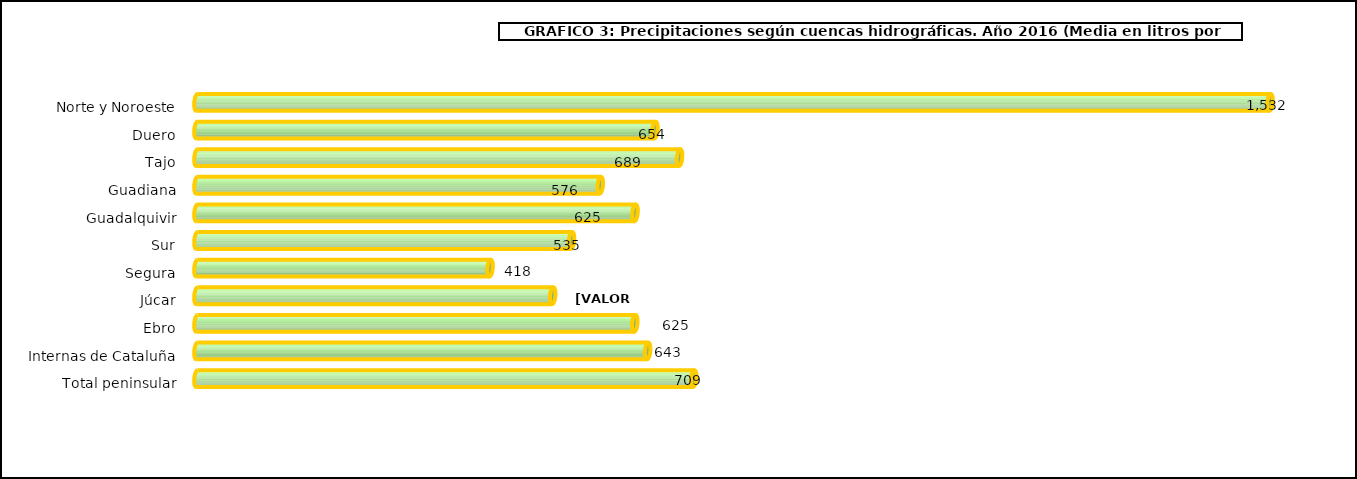
| Category | cuencas |
|---|---|
| 0 | 1531.5 |
| 1 | 653.6 |
| 2 | 688.8 |
| 3 | 575.6 |
| 4 | 625.2 |
| 5 | 534.6 |
| 6 | 418.3 |
| 7 | 507.7 |
| 8 | 624.9 |
| 9 | 643.2 |
| 10 | 708.909 |